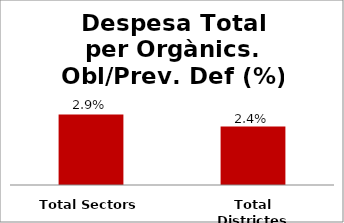
| Category | Series 0 |
|---|---|
| Total Sectors | 0.029 |
| Total Districtes | 0.024 |